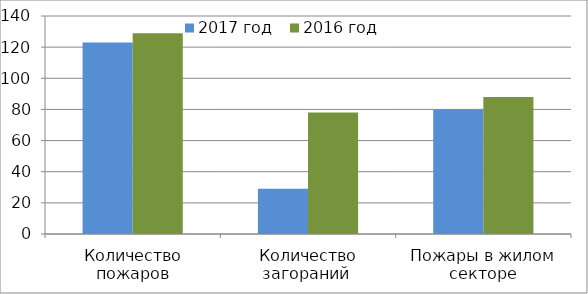
| Category | 2017 год | 2016 год |
|---|---|---|
| Количество пожаров | 123 | 129 |
| Количество загораний  | 29 | 78 |
| Пожары в жилом секторе | 80 | 88 |